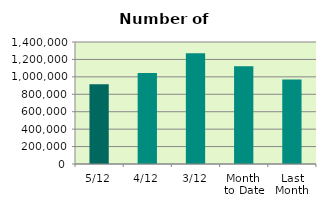
| Category | Series 0 |
|---|---|
| 5/12 | 915686 |
| 4/12 | 1045110 |
| 3/12 | 1271942 |
| Month 
to Date | 1122122 |
| Last
Month | 969317.238 |